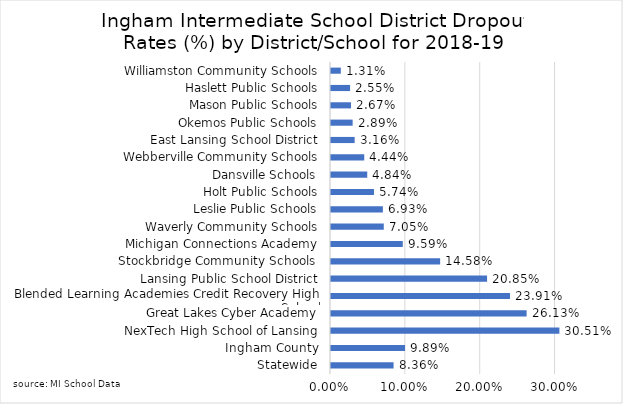
| Category | Series 0 |
|---|---|
| Statewide | 0.084 |
| Ingham County | 0.099 |
| NexTech High School of Lansing | 0.305 |
| Great Lakes Cyber Academy | 0.261 |
| Blended Learning Academies Credit Recovery High School | 0.239 |
| Lansing Public School District | 0.208 |
| Stockbridge Community Schools  | 0.146 |
| Michigan Connections Academy | 0.096 |
| Waverly Community Schools | 0.07 |
| Leslie Public Schools | 0.069 |
| Holt Public Schools | 0.057 |
| Dansville Schools | 0.048 |
| Webberville Community Schools | 0.044 |
| East Lansing School District | 0.032 |
| Okemos Public Schools | 0.029 |
| Mason Public Schools | 0.027 |
| Haslett Public Schools | 0.026 |
| Williamston Community Schools | 0.013 |